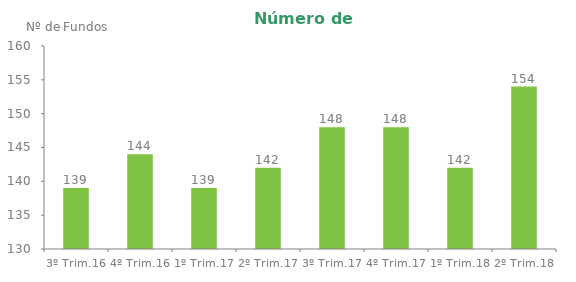
| Category | Series 0 |
|---|---|
| 3º Trim.16 | 139 |
| 4º Trim.16 | 144 |
| 1º Trim.17 | 139 |
| 2º Trim.17 | 142 |
| 3º Trim.17 | 148 |
| 4º Trim.17 | 148 |
| 1º Trim.18 | 142 |
| 2º Trim.18 | 154 |